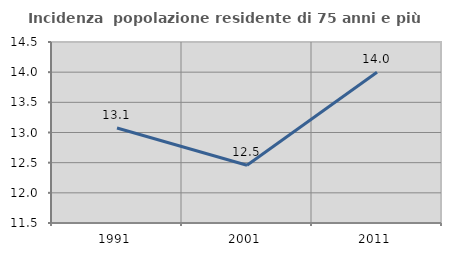
| Category | Incidenza  popolazione residente di 75 anni e più |
|---|---|
| 1991.0 | 13.076 |
| 2001.0 | 12.457 |
| 2011.0 | 13.998 |